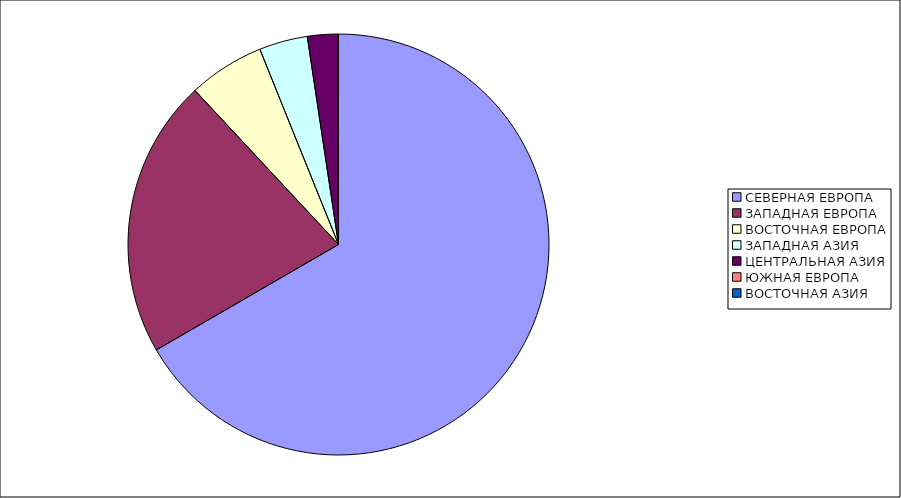
| Category | Оборот |
|---|---|
| СЕВЕРНАЯ ЕВРОПА | 66.647 |
| ЗАПАДНАЯ ЕВРОПА | 21.416 |
| ВОСТОЧНАЯ ЕВРОПА | 5.844 |
| ЗАПАДНАЯ АЗИЯ | 3.72 |
| ЦЕНТРАЛЬНАЯ АЗИЯ | 2.358 |
| ЮЖНАЯ ЕВРОПА | 0.013 |
| ВОСТОЧНАЯ АЗИЯ | 0.002 |